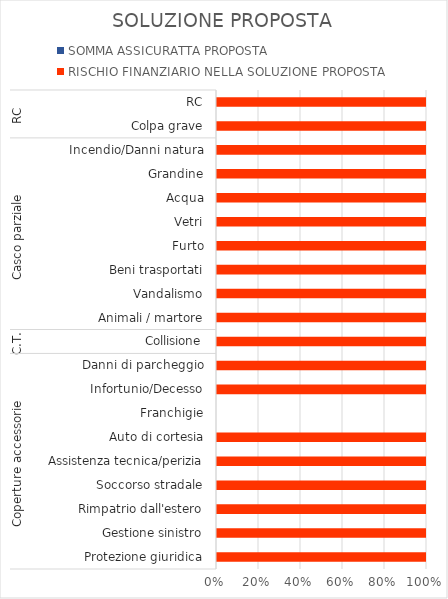
| Category | SOMMA ASSICURATTA PROPOSTA | RISCHIO FINANZIARIO NELLA SOLUZIONE PROPOSTA |
|---|---|---|
| 0 | 0 | 250000 |
| 1 | 0 | 500 |
| 2 | 0 | 10000 |
| 3 | 0 | 5000 |
| 4 | 0 | 500 |
| 5 | 0 | 1000 |
| 6 | 0 | 0 |
| 7 | 0 | 90000 |
| 8 | 0 | 2000 |
| 9 | 0 | 20000 |
| 10 | 0 | 1000 |
| 11 | 0 | 20000 |
| 12 | 0 | 10000 |
| 13 | 0 | 20000 |
| 14 | 0 | 1000 |
| 15 | 0 | 2000 |
| 16 | 0 | 20000 |
| 17 | 0 | 20000 |
| 18 | 0 | 5000000 |
| 19 | 0 | 5000000 |